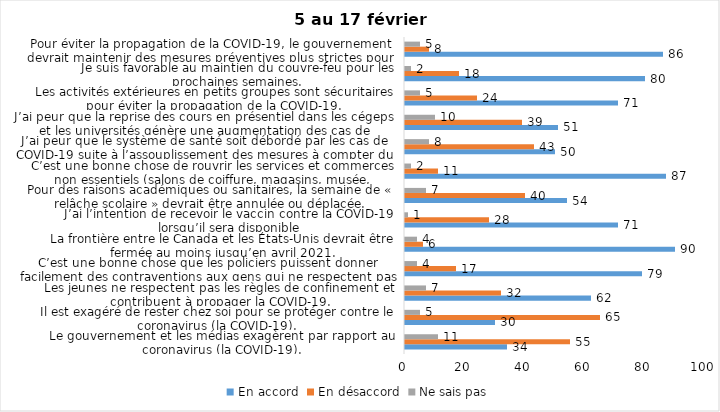
| Category | En accord | En désaccord | Ne sais pas |
|---|---|---|---|
| Le gouvernement et les médias exagèrent par rapport au coronavirus (la COVID-19). | 34 | 55 | 11 |
| Il est exagéré de rester chez soi pour se protéger contre le coronavirus (la COVID-19). | 30 | 65 | 5 |
| Les jeunes ne respectent pas les règles de confinement et contribuent à propager la COVID-19. | 62 | 32 | 7 |
| C’est une bonne chose que les policiers puissent donner facilement des contraventions aux gens qui ne respectent pas les mesures pour prévenir la COVID-19. | 79 | 17 | 4 |
| La frontière entre le Canada et les États-Unis devrait être fermée au moins jusqu’en avril 2021. | 90 | 6 | 4 |
| J’ai l’intention de recevoir le vaccin contre la COVID-19 lorsqu’il sera disponible | 71 | 28 | 1 |
| Pour des raisons académiques ou sanitaires, la semaine de « relâche scolaire » devrait être annulée ou déplacée. | 54 | 40 | 7 |
| C’est une bonne chose de rouvrir les services et commerces non essentiels (salons de coiffure, magasins, musée, industries) à partir du 8 février 2021. | 87 | 11 | 2 |
| J’ai peur que le système de santé soit débordé par les cas de COVID-19 suite à l’assouplissement des mesures à compter du 8 février 2021. | 50 | 43 | 8 |
| J’ai peur que la reprise des cours en présentiel dans les cégeps et les universités génère une augmentation des cas de COVID-19. | 51 | 39 | 10 |
| Les activités extérieures en petits groupes sont sécuritaires pour éviter la propagation de la COVID-19. | 71 | 24 | 5 |
| Je suis favorable au maintien du couvre-feu pour les prochaines semaines. | 80 | 18 | 2 |
| Pour éviter la propagation de la COVID-19, le gouvernement devrait maintenir des mesures préventives plus strictes pour la grande région de Montréal. | 86 | 8 | 5 |